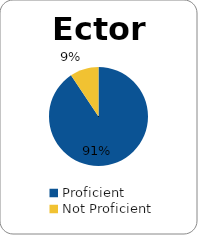
| Category | Series 0 |
|---|---|
| Proficient | 0.906 |
| Not Proficient | 0.094 |